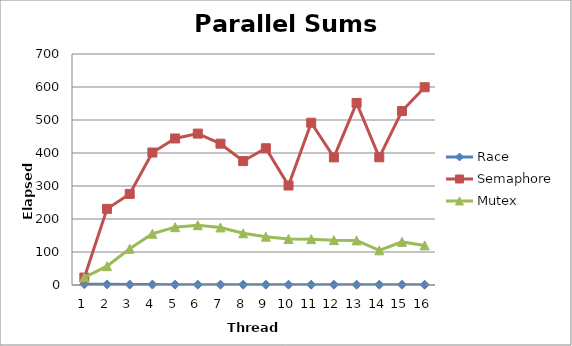
| Category | Race | Semaphore | Mutex |
|---|---|---|---|
| 0 | 2.46 | 22.56 | 23.36 |
| 1 | 1.94 | 230.76 | 56.97 |
| 2 | 1.4 | 276.02 | 109.73 |
| 3 | 1.31 | 401.44 | 155.4 |
| 4 | 1.05 | 444 | 175.27 |
| 5 | 1.02 | 458.8 | 181.17 |
| 6 | 0.96 | 428.21 | 174.41 |
| 7 | 0.9 | 375.56 | 156.6 |
| 8 | 0.92 | 414.38 | 146.46 |
| 9 | 0.91 | 301.51 | 139.39 |
| 10 | 0.91 | 491.76 | 139 |
| 11 | 0.89 | 386.66 | 135.95 |
| 12 | 0.86 | 551.62 | 135.16 |
| 13 | 0.86 | 386.97 | 104.93 |
| 14 | 0.88 | 527 | 130.6 |
| 15 | 0.86 | 599.33 | 119.94 |